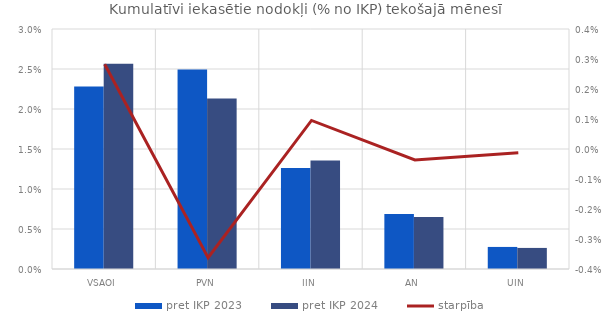
| Category | pret IKP 2023 | pret IKP 2024 |
|---|---|---|
| VSAOI | 0.023 | 0.026 |
| PVN | 0.025 | 0.021 |
| IIN | 0.013 | 0.014 |
| AN | 0.007 | 0.006 |
| UIN | 0.003 | 0.003 |